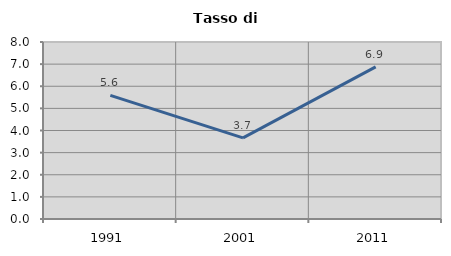
| Category | Tasso di disoccupazione   |
|---|---|
| 1991.0 | 5.587 |
| 2001.0 | 3.666 |
| 2011.0 | 6.875 |